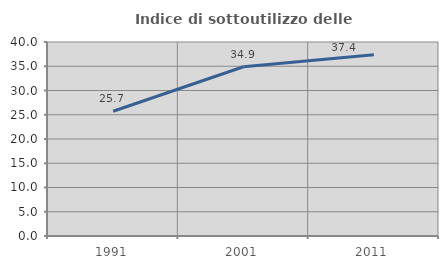
| Category | Indice di sottoutilizzo delle abitazioni  |
|---|---|
| 1991.0 | 25.714 |
| 2001.0 | 34.898 |
| 2011.0 | 37.372 |